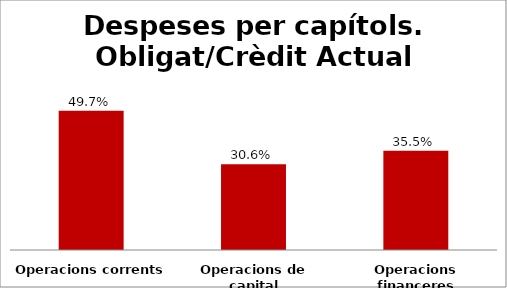
| Category | Series 0 |
|---|---|
| Operacions corrents | 0.497 |
| Operacions de capital | 0.306 |
| Operacions financeres | 0.355 |